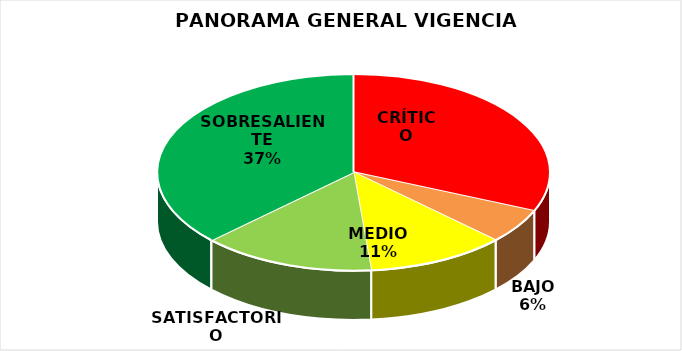
| Category | Series 0 |
|---|---|
| CRÍTICO | 11 |
| BAJO | 2 |
| MEDIO | 4 |
| SATISFACTORIO | 5 |
| SOBRESALIENTE | 13 |